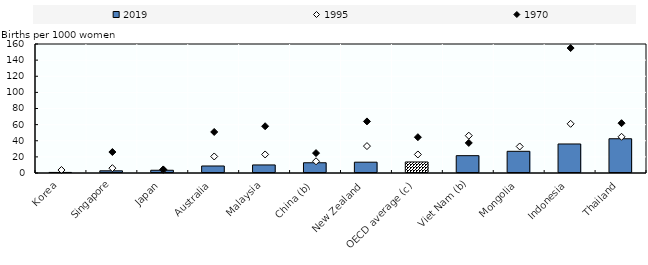
| Category | 2019 |
|---|---|
| Korea | 0.7 |
| Singapore | 2.72 |
| Japan | 3.4 |
| Australia | 8.7 |
| Malaysia | 10 |
| China (b) | 12.7 |
| New Zealand | 13.4 |
| OECD average (c) | 13.663 |
| Viet Nam (b) | 21.5 |
| Mongolia | 26.9 |
| Indonesia | 36 |
| Thailand | 42.5 |